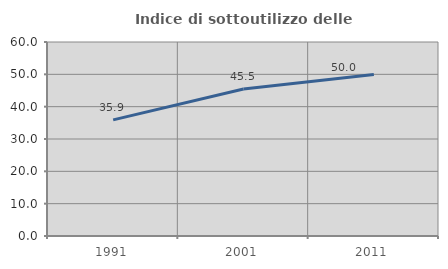
| Category | Indice di sottoutilizzo delle abitazioni  |
|---|---|
| 1991.0 | 35.924 |
| 2001.0 | 45.48 |
| 2011.0 | 49.967 |